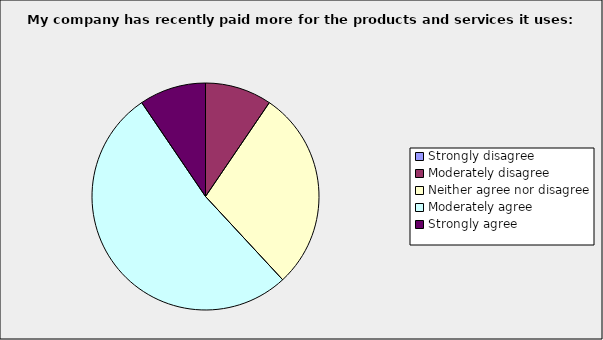
| Category | Series 0 |
|---|---|
| Strongly disagree | 0 |
| Moderately disagree | 0.095 |
| Neither agree nor disagree | 0.286 |
| Moderately agree | 0.524 |
| Strongly agree | 0.095 |